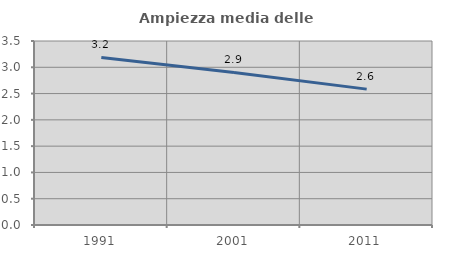
| Category | Ampiezza media delle famiglie |
|---|---|
| 1991.0 | 3.188 |
| 2001.0 | 2.902 |
| 2011.0 | 2.585 |